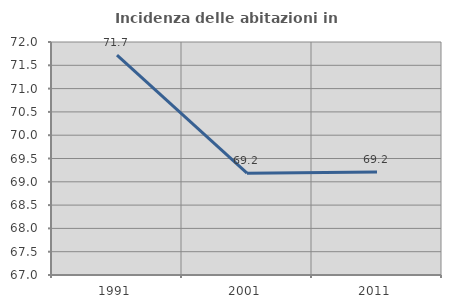
| Category | Incidenza delle abitazioni in proprietà  |
|---|---|
| 1991.0 | 71.718 |
| 2001.0 | 69.186 |
| 2011.0 | 69.208 |